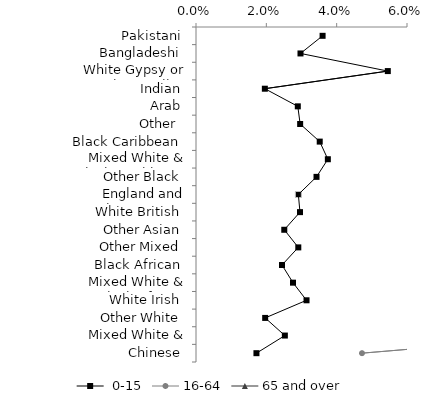
| Category | Series 0 |
|---|---|
| Pakistani | 0.036 |
| Bangladeshi | 0.03 |
| White Gypsy or Irish Traveller | 0.055 |
| Indian | 0.02 |
| Arab | 0.029 |
| Other  | 0.03 |
| Black Caribbean | 0.035 |
| Mixed White & Black Caribbean | 0.037 |
| Other Black | 0.034 |
| England and Wales Average | 0.029 |
| White British | 0.03 |
| Other Asian | 0.025 |
| Other Mixed | 0.029 |
| Black African | 0.024 |
| Mixed White & Black African | 0.028 |
| White Irish | 0.031 |
| Other White | 0.02 |
| Mixed White & Asian | 0.025 |
| Chinese | 0.017 |